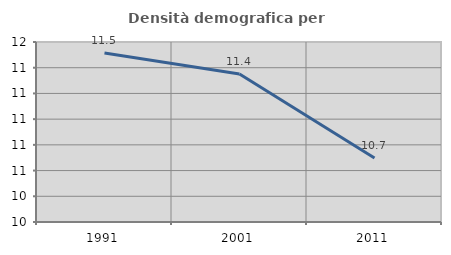
| Category | Densità demografica |
|---|---|
| 1991.0 | 11.515 |
| 2001.0 | 11.352 |
| 2011.0 | 10.698 |